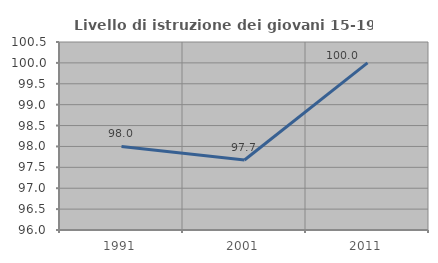
| Category | Livello di istruzione dei giovani 15-19 anni |
|---|---|
| 1991.0 | 98 |
| 2001.0 | 97.674 |
| 2011.0 | 100 |